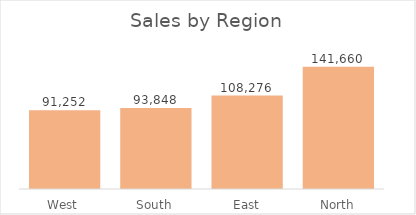
| Category | Total |
|---|---|
| West | 91251.98 |
| South | 93848.33 |
| East | 108275.51 |
| North | 141660.34 |